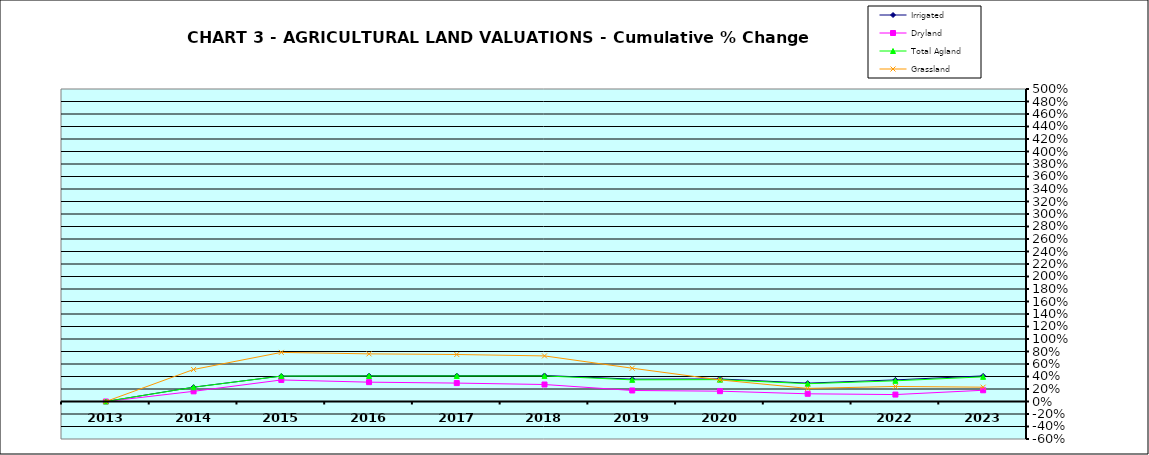
| Category | Irrigated | Dryland | Total Agland | Grassland |
|---|---|---|---|---|
| 2013.0 | 0 | 0 | 0 | 0 |
| 2014.0 | 0.23 | 0.163 | 0.228 | 0.512 |
| 2015.0 | 0.407 | 0.345 | 0.407 | 0.786 |
| 2016.0 | 0.412 | 0.309 | 0.408 | 0.762 |
| 2017.0 | 0.413 | 0.295 | 0.409 | 0.752 |
| 2018.0 | 0.417 | 0.272 | 0.41 | 0.729 |
| 2019.0 | 0.358 | 0.176 | 0.346 | 0.533 |
| 2020.0 | 0.361 | 0.165 | 0.35 | 0.345 |
| 2021.0 | 0.294 | 0.123 | 0.284 | 0.209 |
| 2022.0 | 0.346 | 0.111 | 0.331 | 0.241 |
| 2023.0 | 0.41 | 0.18 | 0.394 | 0.229 |